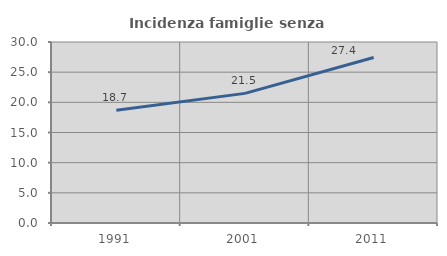
| Category | Incidenza famiglie senza nuclei |
|---|---|
| 1991.0 | 18.673 |
| 2001.0 | 21.484 |
| 2011.0 | 27.431 |